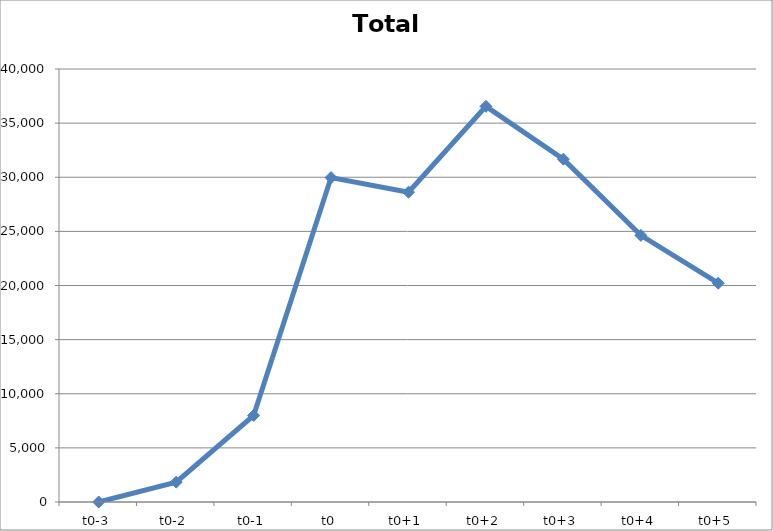
| Category | Total [K$] |
|---|---|
| t0-3 | 0 |
| t0-2 | 1835.788 |
| t0-1 | 7994.945 |
| t0 | 29969.895 |
| t0+1 | 28620.602 |
| t0+2 | 36552.138 |
| t0+3 | 31671.271 |
| t0+4 | 24633.849 |
| t0+5 | 20210.796 |